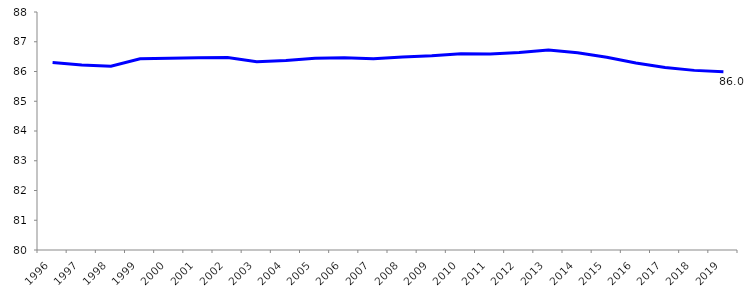
| Category | Part du Public |
|---|---|
| 1996.0 | 86.304 |
| 1997.0 | 86.216 |
| 1998.0 | 86.175 |
| 1999.0 | 86.431 |
| 2000.0 | 86.446 |
| 2001.0 | 86.464 |
| 2002.0 | 86.467 |
| 2003.0 | 86.328 |
| 2004.0 | 86.373 |
| 2005.0 | 86.442 |
| 2006.0 | 86.46 |
| 2007.0 | 86.432 |
| 2008.0 | 86.491 |
| 2009.0 | 86.529 |
| 2010.0 | 86.595 |
| 2011.0 | 86.59 |
| 2012.0 | 86.635 |
| 2013.0 | 86.726 |
| 2014.0 | 86.629 |
| 2015.0 | 86.481 |
| 2016.0 | 86.283 |
| 2017.0 | 86.134 |
| 2018.0 | 86.038 |
| 2019.0 | 85.995 |